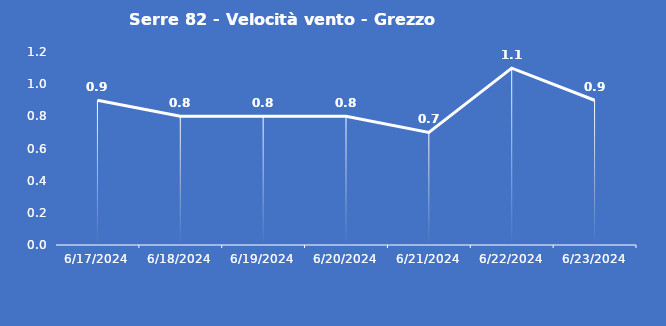
| Category | Serre 82 - Velocità vento - Grezzo (m/s) |
|---|---|
| 6/17/24 | 0.9 |
| 6/18/24 | 0.8 |
| 6/19/24 | 0.8 |
| 6/20/24 | 0.8 |
| 6/21/24 | 0.7 |
| 6/22/24 | 1.1 |
| 6/23/24 | 0.9 |